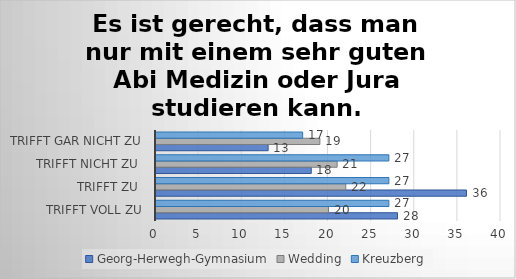
| Category | Georg-Herwegh-Gymnasium | Wedding | Kreuzberg |
|---|---|---|---|
| trifft voll zu | 28 | 20 | 27 |
| trifft zu  | 36 | 22 | 27 |
| trifft nicht zu  | 18 | 21 | 27 |
| trifft gar nicht zu | 13 | 19 | 17 |